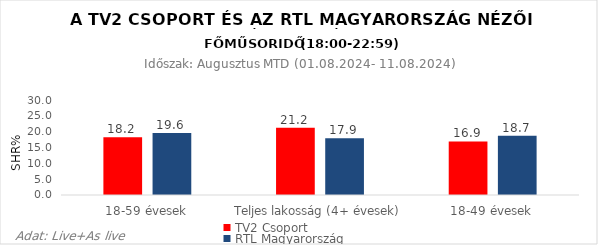
| Category | TV2 Csoport | RTL Magyarország |
|---|---|---|
| 18-59 évesek | 18.2 | 19.6 |
| Teljes lakosság (4+ évesek) | 21.2 | 17.9 |
| 18-49 évesek | 16.9 | 18.7 |